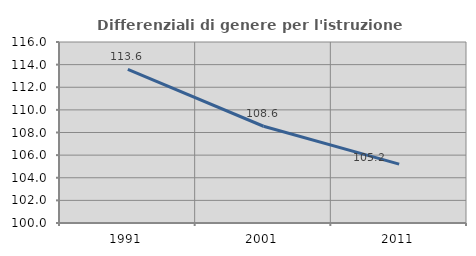
| Category | Differenziali di genere per l'istruzione superiore |
|---|---|
| 1991.0 | 113.588 |
| 2001.0 | 108.553 |
| 2011.0 | 105.207 |